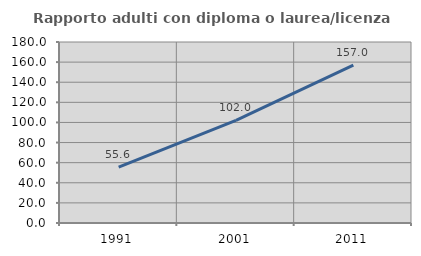
| Category | Rapporto adulti con diploma o laurea/licenza media  |
|---|---|
| 1991.0 | 55.556 |
| 2001.0 | 101.961 |
| 2011.0 | 156.989 |